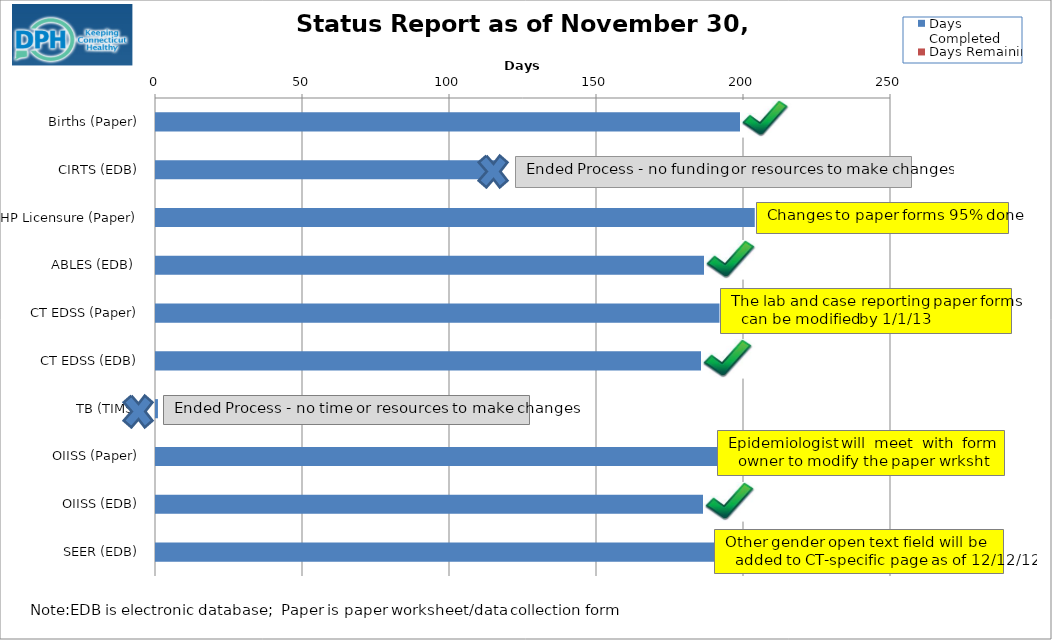
| Category | Days Completed | Days Remaining |
|---|---|---|
| Births (Paper) | 202 | 0 |
| CIRTS (EDB) | 117 | 0 |
| HP Licensure (Paper) | 204 | 0 |
| ABLES (EDB)  | 189 | 0 |
| CT EDSS (Paper) | 192 | 0 |
| CT EDSS (EDB) | 189 | 0 |
| TB (TIMS) | 1 | 0 |
| OIISS (Paper) | 192 | 0 |
| OIISS (EDB) | 189 | 0 |
| SEER (EDB) | 192 | 0 |